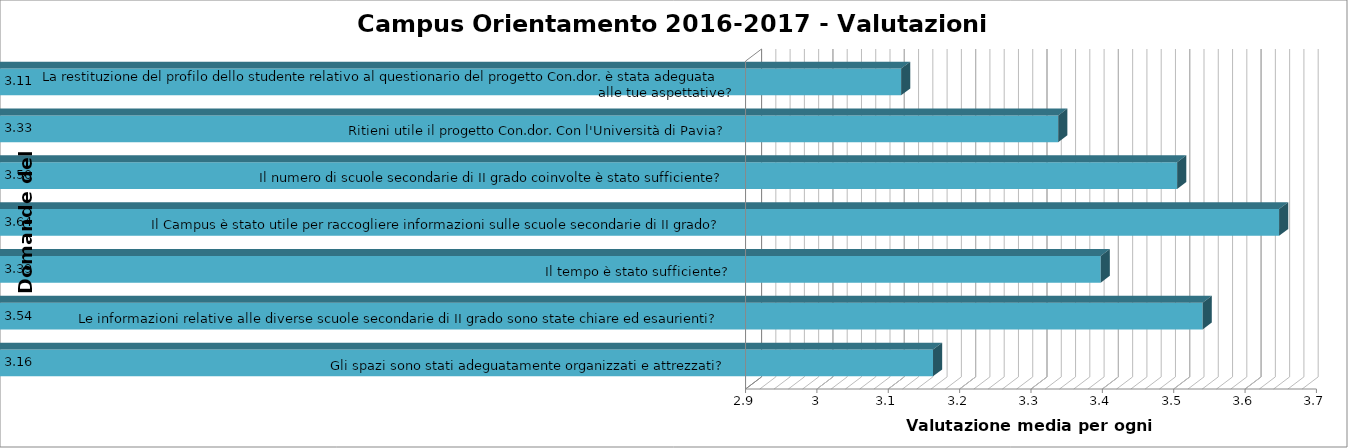
| Category | Series 0 | Series 1 | Series 2 | Series 3 | Series 4 |
|---|---|---|---|---|---|
| Gli spazi sono stati adeguatamente organizzati e attrezzati? |  |  |  |  | 3.158 |
| Le informazioni relative alle diverse scuole secondarie di II grado sono state chiare ed esaurienti? |  |  |  |  | 3.536 |
| Il tempo è stato sufficiente? |  |  |  |  | 3.393 |
| Il Campus è stato utile per raccogliere informazioni sulle scuole secondarie di II grado? |  |  |  |  | 3.643 |
| Il numero di scuole secondarie di II grado coinvolte è stato sufficiente? |  |  |  |  | 3.5 |
| Ritieni utile il progetto Con.dor. Con l'Università di Pavia? |  |  |  |  | 3.333 |
| La restituzione del profilo dello studente relativo al questionario del progetto Con.dor. è stata adeguata alle tue aspettative? |  |  |  |  | 3.113 |